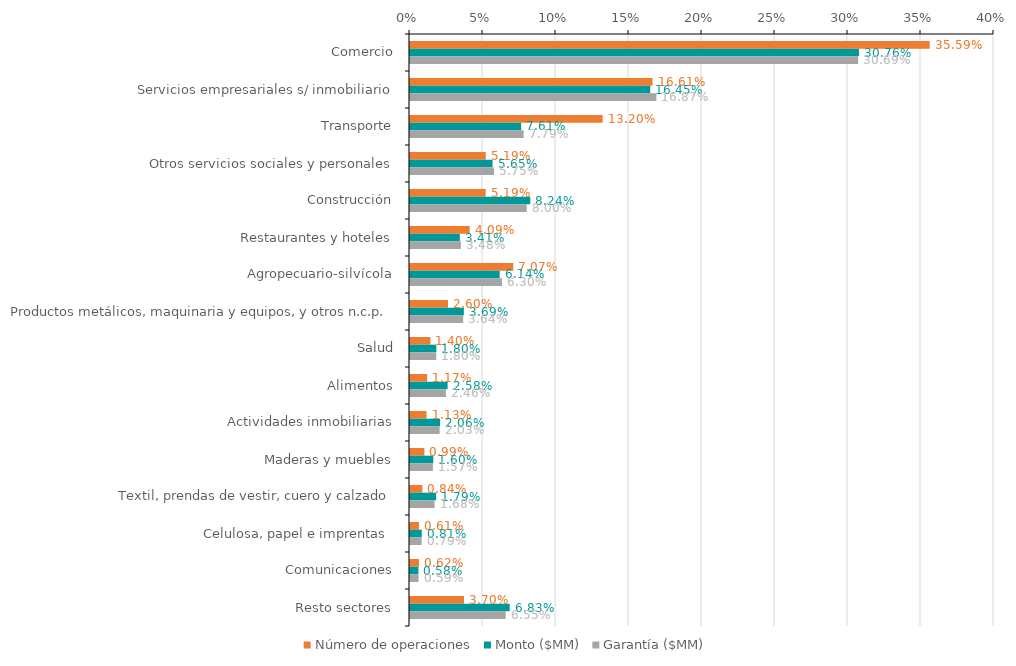
| Category | Número de operaciones | Monto ($MM) | Garantía ($MM) |
|---|---|---|---|
| Comercio | 0.356 | 0.308 | 0.307 |
| Servicios empresariales s/ inmobiliario | 0.166 | 0.165 | 0.169 |
| Transporte | 0.132 | 0.076 | 0.078 |
| Otros servicios sociales y personales | 0.052 | 0.057 | 0.058 |
| Construcción | 0.052 | 0.082 | 0.08 |
| Restaurantes y hoteles | 0.041 | 0.034 | 0.035 |
| Agropecuario-silvícola | 0.071 | 0.061 | 0.063 |
| Productos metálicos, maquinaria y equipos, y otros n.c.p. | 0.026 | 0.037 | 0.036 |
| Salud | 0.014 | 0.018 | 0.018 |
| Alimentos | 0.012 | 0.026 | 0.025 |
| Actividades inmobiliarias | 0.011 | 0.021 | 0.02 |
| Maderas y muebles | 0.01 | 0.016 | 0.016 |
| Textil, prendas de vestir, cuero y calzado | 0.008 | 0.018 | 0.017 |
| Celulosa, papel e imprentas  | 0.006 | 0.008 | 0.008 |
| Comunicaciones | 0.006 | 0.006 | 0.006 |
| Resto sectores | 0.037 | 0.068 | 0.066 |